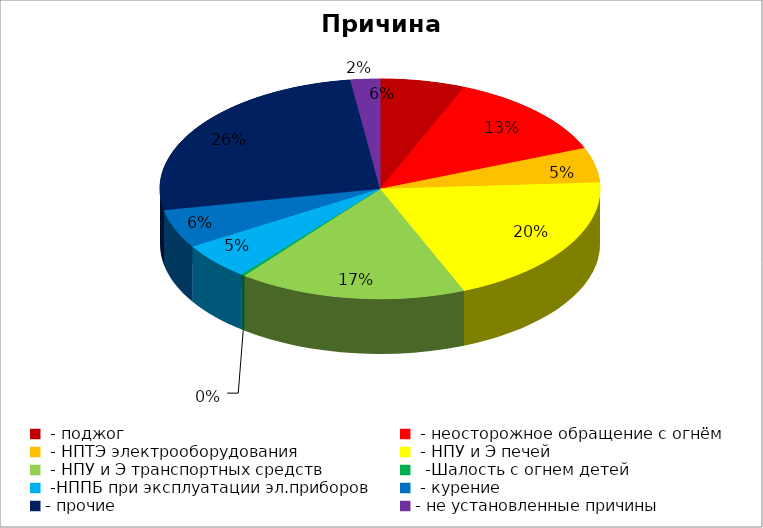
| Category | Причина пожара |
|---|---|
|  - поджог | 23 |
|  - неосторожное обращение с огнём | 47 |
|  - НПТЭ электрооборудования | 19 |
|  - НПУ и Э печей | 73 |
|  - НПУ и Э транспортных средств | 62 |
|   -Шалость с огнем детей | 1 |
|  -НППБ при эксплуатации эл.приборов | 20 |
|  - курение | 21 |
| - прочие | 96 |
| - не установленные причины | 8 |